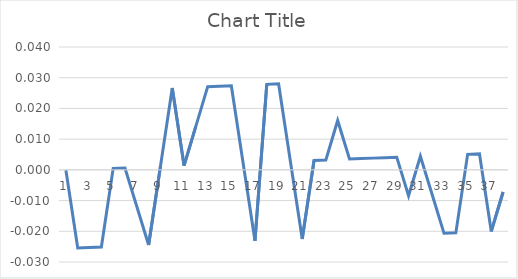
| Category | Series 0 |
|---|---|
| 0 | 0 |
| 1 | -0.025 |
| 2 | -0.025 |
| 3 | -0.025 |
| 4 | 0 |
| 5 | 0.001 |
| 6 | -0.012 |
| 7 | -0.024 |
| 8 | 0.001 |
| 9 | 0.027 |
| 10 | 0.001 |
| 11 | 0.014 |
| 12 | 0.027 |
| 13 | 0.027 |
| 14 | 0.027 |
| 15 | 0.002 |
| 16 | -0.023 |
| 17 | 0.028 |
| 18 | 0.028 |
| 19 | 0.003 |
| 20 | -0.022 |
| 21 | 0.003 |
| 22 | 0.003 |
| 23 | 0.016 |
| 24 | 0.004 |
| 25 | 0.004 |
| 26 | 0.004 |
| 27 | 0.004 |
| 28 | 0.004 |
| 29 | -0.008 |
| 30 | 0.004 |
| 31 | -0.008 |
| 32 | -0.021 |
| 33 | -0.021 |
| 34 | 0.005 |
| 35 | 0.005 |
| 36 | -0.02 |
| 37 | -0.007 |